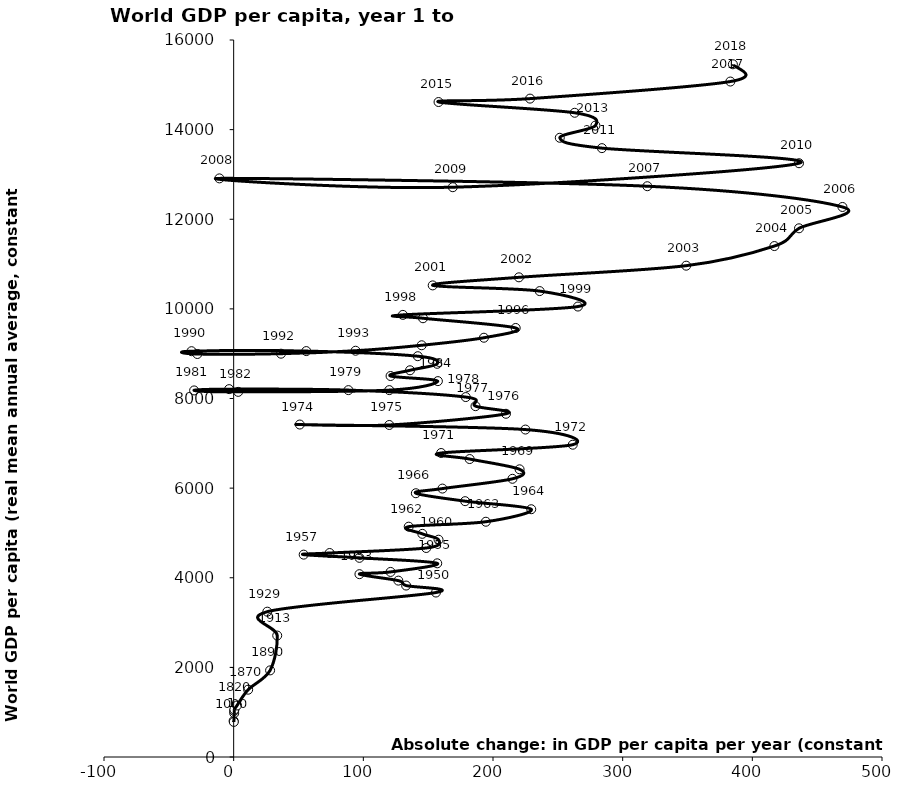
| Category | Series 0 |
|---|---|
| -0.02307543297312786 | 805.966 |
| 0.11477572316393655 | 782.914 |
| 0.40976336995924156 | 978.015 |
| 0.41842798112060847 | 1028.772 |
| 0.5490405482566416 | 1061.7 |
| 2.589998108253093 | 1149.561 |
| 11.191992837114816 | 1502 |
| 28.093023255813954 | 1933 |
| 33.58974358974359 | 2710 |
| 25.945945945945947 | 3243 |
| 156.0 | 3670 |
| 133.0 | 3826 |
| 127.0 | 3936 |
| 97.0 | 4080 |
| 121.0 | 4130 |
| 157.0 | 4322 |
| 97.0 | 4444 |
| 54.0 | 4516 |
| 74.0 | 4552 |
| 148.5 | 4664 |
| 158.0 | 4849 |
| 145.5 | 4980 |
| 135.0 | 5140 |
| 194.5 | 5250 |
| 229.5 | 5529 |
| 178.5 | 5709 |
| 140.5 | 5886 |
| 161.0 | 5990 |
| 215.0 | 6208 |
| 220.5 | 6420 |
| 182.0 | 6649 |
| 160.0 | 6784 |
| 261.5 | 6969 |
| 225.0 | 7307 |
| 51.0 | 7419 |
| 120.0 | 7409 |
| 210.0 | 7659 |
| 186.5 | 7829 |
| 179.0 | 8032 |
| 88.5 | 8187 |
| -3.5 | 8209 |
| -30.5 | 8180 |
| 3.5 | 8148 |
| 120.0 | 8187 |
| 157.5 | 8388 |
| 121.0 | 8502 |
| 136.0 | 8630 |
| 157.0 | 8774 |
| 142.0 | 8944 |
| 56.0 | 9058 |
| -32.5 | 9056 |
| -28.0 | 8993 |
| 36.5 | 9000 |
| 94.0 | 9066 |
| 145.0 | 9188 |
| 193.0 | 9356 |
| 217.5 | 9574 |
| 146.0 | 9791 |
| 130.5 | 9866 |
| 265.5 | 10052 |
| 236.0 | 10397 |
| 153.5 | 10524 |
| 220.0 | 10704 |
| 349.0 | 10964 |
| 417.0 | 11402 |
| 436.0 | 11798 |
| 469.5 | 12274 |
| 319.0 | 12737 |
| -11.0 | 12912 |
| 169.0 | 12715 |
| 436.0 | 13250 |
| 284.0 | 13587 |
| 251.5 | 13818 |
| 279.0 | 14090 |
| 263.0 | 14376 |
| 158.0 | 14616 |
| 228.5596039603961 | 14692 |
| 383.05874587458766 | 15073.119 |
| 384.99828382838314 | 15458.117 |